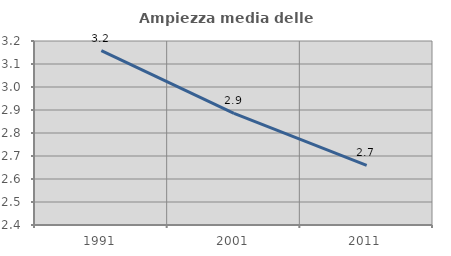
| Category | Ampiezza media delle famiglie |
|---|---|
| 1991.0 | 3.158 |
| 2001.0 | 2.885 |
| 2011.0 | 2.659 |